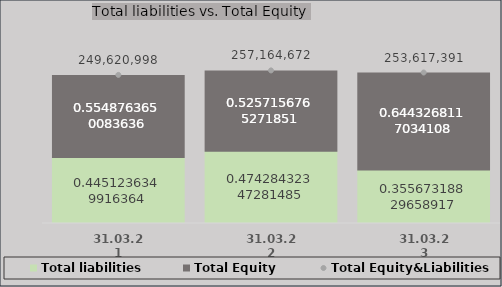
| Category | Total liabilities | Total Equity |
|---|---|---|
| 31.03.21 | 111112206 | 138508792 |
| 31.03.22 | 121969172.4 | 135195499.43 |
| 31.03.23 | 90204906.1 | 163412485 |